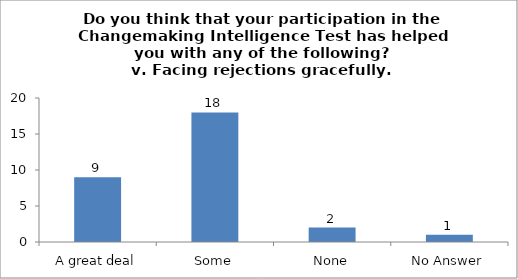
| Category | Do you think that your participation in the Changemaking Intelligence Test has helped you with any of the following?
v. Facing rejections gracefully. |
|---|---|
| A great deal | 9 |
| Some | 18 |
| None | 2 |
| No Answer | 1 |